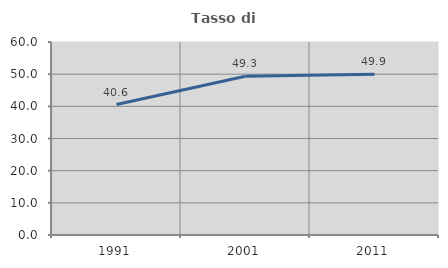
| Category | Tasso di occupazione   |
|---|---|
| 1991.0 | 40.554 |
| 2001.0 | 49.327 |
| 2011.0 | 49.948 |